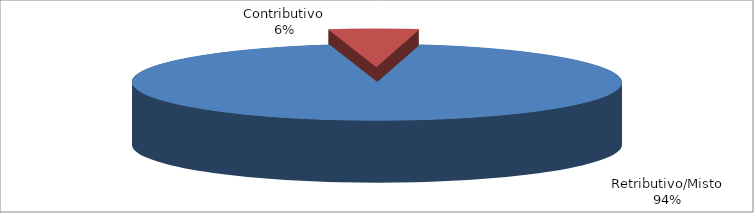
| Category | Series 1 |
|---|---|
| Retributivo/Misto | 78849 |
| Contributivo | 4930 |